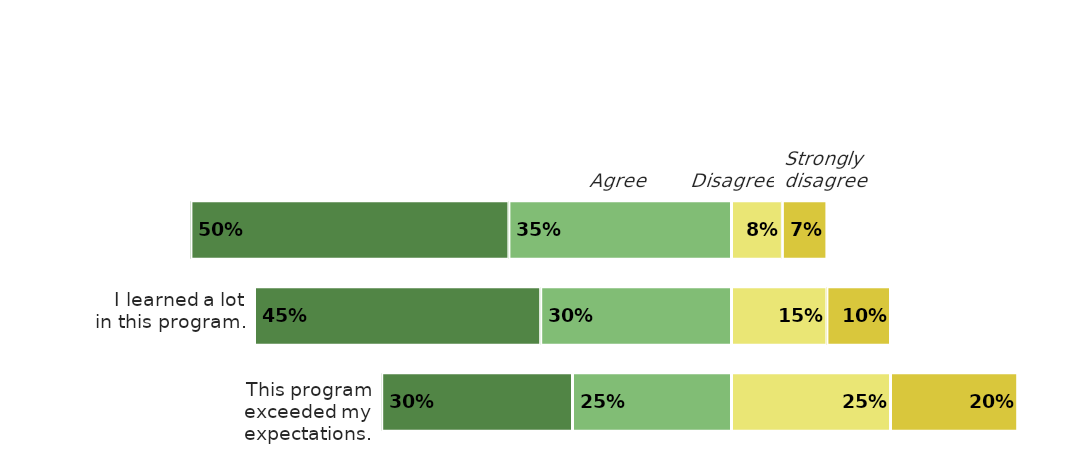
| Category | Floating white bar | Strongly agree | Agree | Disagree | Strongly disagree |
|---|---|---|---|---|---|
| This program exceeded my expectations. | 0.05 | 0.3 | 0.25 | 0.25 | 0.2 |
| I learned a lot in this program. | 0.25 | 0.45 | 0.3 | 0.15 | 0.1 |
| I'd recommend this program to a friend. | 0.35 | 0.5 | 0.35 | 0.08 | 0.07 |